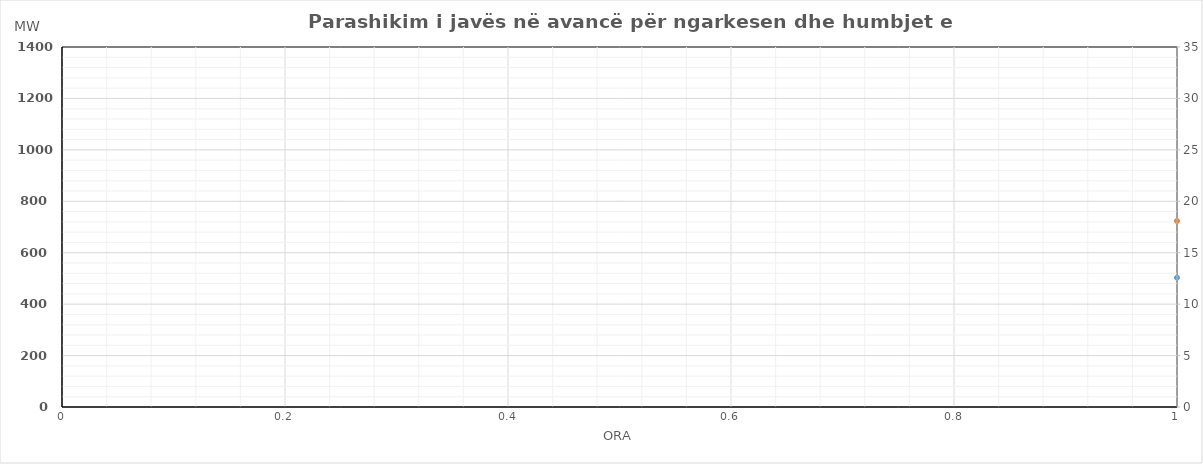
| Category | Ngarkesa (MWh) |
|---|---|
| 0 | 723.56 |
| 1 | 652.47 |
| 2 | 615.22 |
| 3 | 593.08 |
| 4 | 599.26 |
| 5 | 628.93 |
| 6 | 714.42 |
| 7 | 846.01 |
| 8 | 949.71 |
| 9 | 991.25 |
| 10 | 1017.86 |
| 11 | 1110.96 |
| 12 | 1141.45 |
| 13 | 1161.25 |
| 14 | 1151.26 |
| 15 | 1139.45 |
| 16 | 1132.66 |
| 17 | 1173.24 |
| 18 | 1192.67 |
| 19 | 1193.47 |
| 20 | 1209.42 |
| 21 | 1195.79 |
| 22 | 1084.15 |
| 23 | 932.68 |
| 24 | 767.03 |
| 25 | 692.9 |
| 26 | 652.27 |
| 27 | 629.38 |
| 28 | 626.64 |
| 29 | 660.25 |
| 30 | 745.7 |
| 31 | 887.91 |
| 32 | 996.2 |
| 33 | 1052.32 |
| 34 | 1071.2 |
| 35 | 1125.31 |
| 36 | 1156.31 |
| 37 | 1168.7 |
| 38 | 1150.93 |
| 39 | 1143.83 |
| 40 | 1149.54 |
| 41 | 1141.16 |
| 42 | 1177.51 |
| 43 | 1211.15 |
| 44 | 1248.8 |
| 45 | 1158.1 |
| 46 | 1042.02 |
| 47 | 902.91 |
| 48 | 695.825 |
| 49 | 628.095 |
| 50 | 592.65 |
| 51 | 573.68 |
| 52 | 575.775 |
| 53 | 605.74 |
| 54 | 687.425 |
| 55 | 813.65 |
| 56 | 911.85 |
| 57 | 950.16 |
| 58 | 977.51 |
| 59 | 1035.71 |
| 60 | 1053.25 |
| 61 | 1071.35 |
| 62 | 1056.555 |
| 63 | 1043.475 |
| 64 | 1037.665 |
| 65 | 1069.175 |
| 66 | 1096.98 |
| 67 | 1108.145 |
| 68 | 1128.46 |
| 69 | 1093.63 |
| 70 | 983.28 |
| 71 | 847.63 |
| 72 | 719.47 |
| 73 | 654.56 |
| 74 | 616.845 |
| 75 | 597.495 |
| 76 | 596.06 |
| 77 | 627.215 |
| 78 | 710.42 |
| 79 | 842.03 |
| 80 | 939.73 |
| 81 | 983.995 |
| 82 | 1000.09 |
| 83 | 1039.95 |
| 84 | 1058.23 |
| 85 | 1069.945 |
| 86 | 1052.01 |
| 87 | 1043.6 |
| 88 | 1051.61 |
| 89 | 1057.61 |
| 90 | 1094.57 |
| 91 | 1123.195 |
| 92 | 1158.095 |
| 93 | 1081.59 |
| 94 | 968.08 |
| 95 | 839.125 |
| 96 | 700.675 |
| 97 | 634.9 |
| 98 | 598.925 |
| 99 | 579.725 |
| 100 | 580.87 |
| 101 | 610.34 |
| 102 | 690.46 |
| 103 | 816.67 |
| 104 | 912.165 |
| 105 | 953.44 |
| 106 | 971.33 |
| 107 | 1030.285 |
| 108 | 1065.67 |
| 109 | 1083.455 |
| 110 | 1073.41 |
| 111 | 1062.71 |
| 112 | 1060.255 |
| 113 | 1095.985 |
| 114 | 1121.57 |
| 115 | 1137.13 |
| 116 | 1162.33 |
| 117 | 1115.075 |
| 118 | 1004.59 |
| 119 | 868.665 |
| 120 | 736.105 |
| 121 | 667.12 |
| 122 | 628.495 |
| 123 | 608.15 |
| 124 | 604.525 |
| 125 | 633.985 |
| 126 | 719.49 |
| 127 | 851.4 |
| 128 | 953.495 |
| 129 | 1002.29 |
| 130 | 1018.33 |
| 131 | 1058.255 |
| 132 | 1086.705 |
| 133 | 1100.91 |
| 134 | 1087.63 |
| 135 | 1079.925 |
| 136 | 1082.775 |
| 137 | 1090.195 |
| 138 | 1125.32 |
| 139 | 1156.91 |
| 140 | 1181.31 |
| 141 | 1107.85 |
| 142 | 994.565 |
| 143 | 862.585 |
| 144 | 722.31 |
| 145 | 653.62 |
| 146 | 616.82 |
| 147 | 595.63 |
| 148 | 600.06 |
| 149 | 632.13 |
| 150 | 720.12 |
| 151 | 844.36 |
| 152 | 940.81 |
| 153 | 981.05 |
| 154 | 1001.11 |
| 155 | 1057.46 |
| 156 | 1076.95 |
| 157 | 1098.5 |
| 158 | 1084.71 |
| 159 | 1070.7 |
| 160 | 1074.06 |
| 161 | 1112.39 |
| 162 | 1146.27 |
| 163 | 1160.77 |
| 164 | 1179.42 |
| 165 | 1138.24 |
| 166 | 1026.475 |
| 167 | 888.655 |